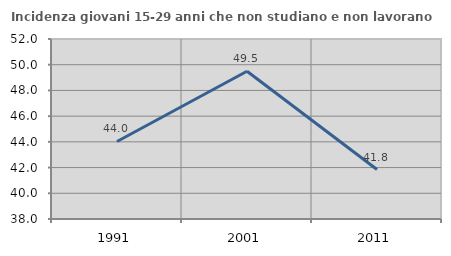
| Category | Incidenza giovani 15-29 anni che non studiano e non lavorano  |
|---|---|
| 1991.0 | 44.03 |
| 2001.0 | 49.493 |
| 2011.0 | 41.849 |